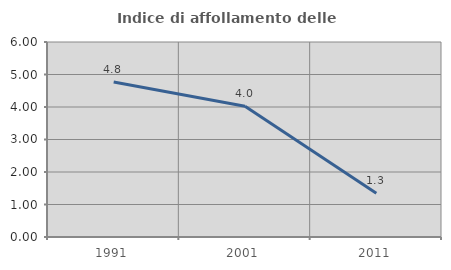
| Category | Indice di affollamento delle abitazioni  |
|---|---|
| 1991.0 | 4.768 |
| 2001.0 | 4.025 |
| 2011.0 | 1.345 |